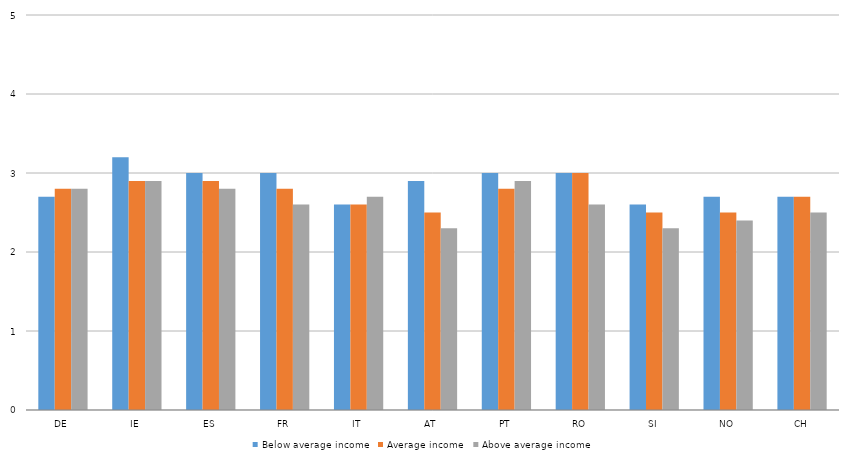
| Category | Below average income | Average income | Above average income |
|---|---|---|---|
| DE | 2.7 | 2.8 | 2.8 |
| IE | 3.2 | 2.9 | 2.9 |
| ES | 3 | 2.9 | 2.8 |
| FR | 3 | 2.8 | 2.6 |
| IT | 2.6 | 2.6 | 2.7 |
| AT | 2.9 | 2.5 | 2.3 |
| PT | 3 | 2.8 | 2.9 |
| RO | 3 | 3 | 2.6 |
| SI | 2.6 | 2.5 | 2.3 |
| NO | 2.7 | 2.5 | 2.4 |
| CH | 2.7 | 2.7 | 2.5 |